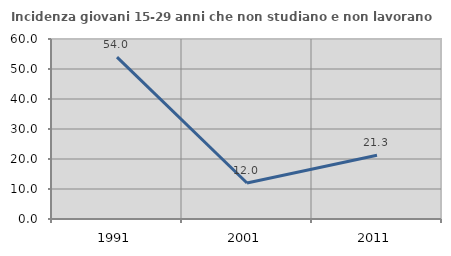
| Category | Incidenza giovani 15-29 anni che non studiano e non lavorano  |
|---|---|
| 1991.0 | 53.969 |
| 2001.0 | 12 |
| 2011.0 | 21.25 |